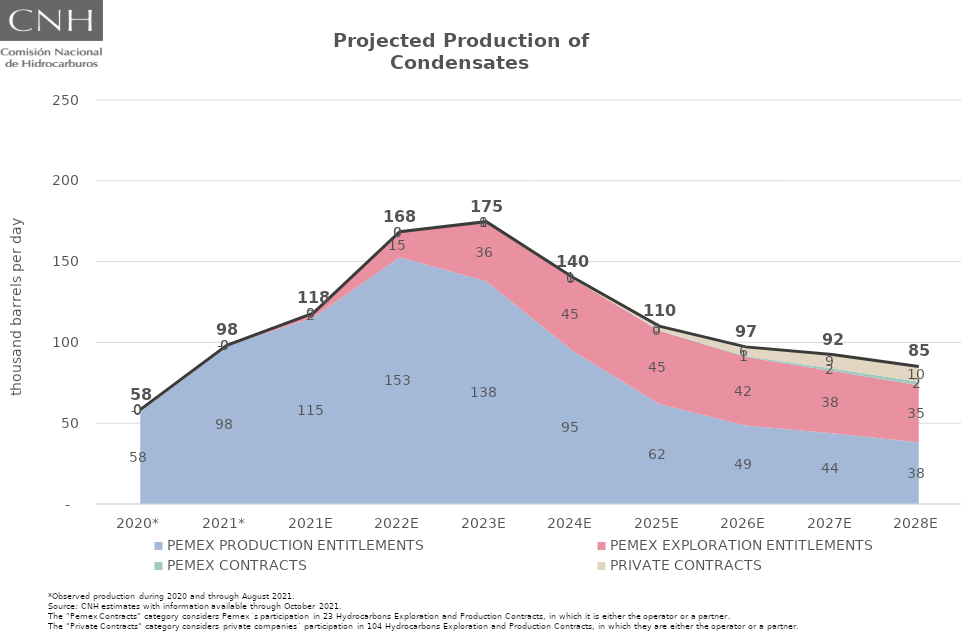
| Category | Total |
|---|---|
| 2020* | 58.422 |
| 2021* | 98.178 |
| 2021E | 118.061 |
| 2022E | 168.483 |
| 2023E | 174.714 |
| 2024E | 140.316 |
| 2025E | 110.091 |
| 2026E | 97.226 |
| 2027E | 92.455 |
| 2028E | 85.132 |